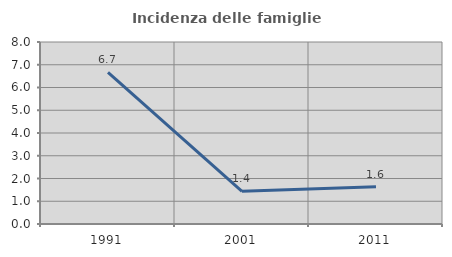
| Category | Incidenza delle famiglie numerose |
|---|---|
| 1991.0 | 6.667 |
| 2001.0 | 1.435 |
| 2011.0 | 1.639 |